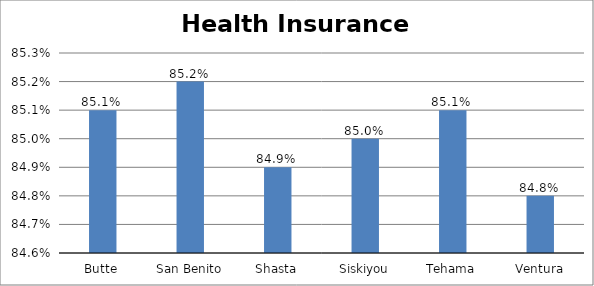
| Category | Series 0 |
|---|---|
| Butte | 0.851 |
| San Benito | 0.852 |
| Shasta | 0.849 |
| Siskiyou | 0.85 |
| Tehama | 0.851 |
| Ventura | 0.848 |